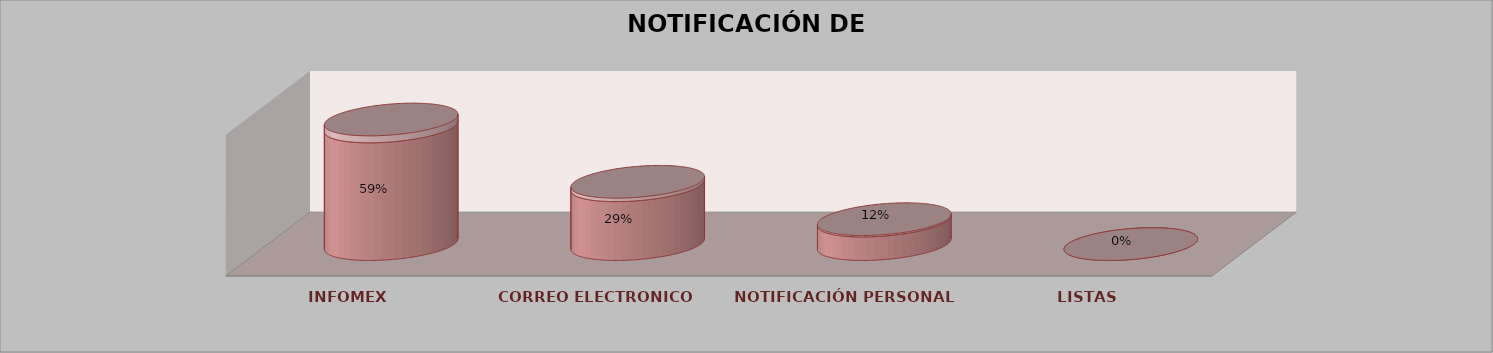
| Category | Series 0 | Series 1 | Series 2 | Series 3 | Series 4 |
|---|---|---|---|---|---|
| INFOMEX |  |  |  | 10 | 0.588 |
| CORREO ELECTRONICO |  |  |  | 5 | 0.294 |
| NOTIFICACIÓN PERSONAL |  |  |  | 2 | 0.118 |
| LISTAS |  |  |  | 0 | 0 |